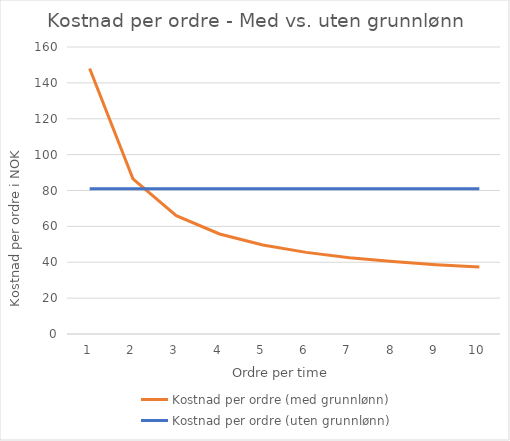
| Category | Kostnad per ordre (med grunnlønn) | Kostnad per ordre (uten grunnlønn) |
|---|---|---|
| 0 | 148 | 81 |
| 1 | 86.5 | 81 |
| 2 | 66 | 81 |
| 3 | 55.75 | 81 |
| 4 | 49.6 | 81 |
| 5 | 45.5 | 81 |
| 6 | 42.571 | 81 |
| 7 | 40.375 | 81 |
| 8 | 38.667 | 81 |
| 9 | 37.3 | 81 |